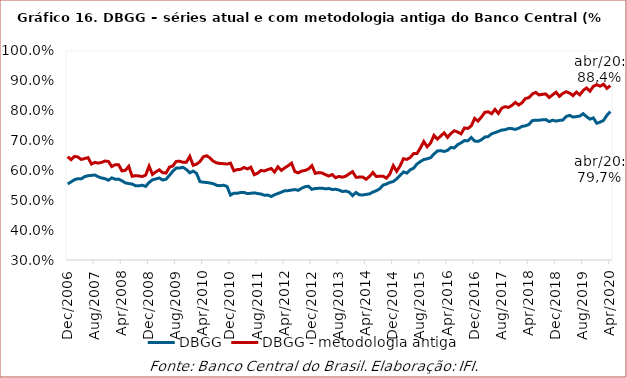
| Category | DBGG | DBGG - metodologia antiga |
|---|---|---|
| 2006-12-01 | 0.555 | 0.646 |
| 2007-01-01 | 0.562 | 0.636 |
| 2007-02-01 | 0.569 | 0.647 |
| 2007-03-01 | 0.572 | 0.645 |
| 2007-04-01 | 0.572 | 0.637 |
| 2007-05-01 | 0.579 | 0.64 |
| 2007-06-01 | 0.582 | 0.643 |
| 2007-07-01 | 0.583 | 0.622 |
| 2007-08-01 | 0.585 | 0.627 |
| 2007-09-01 | 0.579 | 0.625 |
| 2007-10-01 | 0.575 | 0.627 |
| 2007-11-01 | 0.572 | 0.631 |
| 2007-12-01 | 0.567 | 0.63 |
| 2008-01-01 | 0.575 | 0.613 |
| 2008-02-01 | 0.57 | 0.619 |
| 2008-03-01 | 0.571 | 0.619 |
| 2008-04-01 | 0.565 | 0.598 |
| 2008-05-01 | 0.558 | 0.6 |
| 2008-06-01 | 0.556 | 0.614 |
| 2008-07-01 | 0.555 | 0.58 |
| 2008-08-01 | 0.549 | 0.583 |
| 2008-09-01 | 0.548 | 0.582 |
| 2008-10-01 | 0.551 | 0.579 |
| 2008-11-01 | 0.547 | 0.585 |
| 2008-12-01 | 0.56 | 0.614 |
| 2009-01-01 | 0.569 | 0.587 |
| 2009-02-01 | 0.572 | 0.595 |
| 2009-03-01 | 0.575 | 0.602 |
| 2009-04-01 | 0.568 | 0.593 |
| 2009-05-01 | 0.571 | 0.591 |
| 2009-06-01 | 0.583 | 0.611 |
| 2009-07-01 | 0.597 | 0.615 |
| 2009-08-01 | 0.608 | 0.63 |
| 2009-09-01 | 0.608 | 0.631 |
| 2009-10-01 | 0.611 | 0.627 |
| 2009-11-01 | 0.603 | 0.628 |
| 2009-12-01 | 0.592 | 0.647 |
| 2010-01-01 | 0.598 | 0.617 |
| 2010-02-01 | 0.59 | 0.621 |
| 2010-03-01 | 0.562 | 0.63 |
| 2010-04-01 | 0.561 | 0.646 |
| 2010-05-01 | 0.56 | 0.649 |
| 2010-06-01 | 0.558 | 0.641 |
| 2010-07-01 | 0.555 | 0.63 |
| 2010-08-01 | 0.55 | 0.625 |
| 2010-09-01 | 0.549 | 0.623 |
| 2010-10-01 | 0.551 | 0.623 |
| 2010-11-01 | 0.546 | 0.621 |
| 2010-12-01 | 0.518 | 0.624 |
| 2011-01-01 | 0.524 | 0.599 |
| 2011-02-01 | 0.524 | 0.603 |
| 2011-03-01 | 0.526 | 0.604 |
| 2011-04-01 | 0.526 | 0.61 |
| 2011-05-01 | 0.523 | 0.605 |
| 2011-06-01 | 0.524 | 0.611 |
| 2011-07-01 | 0.525 | 0.586 |
| 2011-08-01 | 0.523 | 0.591 |
| 2011-09-01 | 0.521 | 0.6 |
| 2011-10-01 | 0.517 | 0.598 |
| 2011-11-01 | 0.517 | 0.603 |
| 2011-12-01 | 0.513 | 0.606 |
| 2012-01-01 | 0.519 | 0.595 |
| 2012-02-01 | 0.523 | 0.612 |
| 2012-03-01 | 0.527 | 0.6 |
| 2012-04-01 | 0.532 | 0.609 |
| 2012-05-01 | 0.532 | 0.616 |
| 2012-06-01 | 0.534 | 0.624 |
| 2012-07-01 | 0.536 | 0.596 |
| 2012-08-01 | 0.533 | 0.592 |
| 2012-09-01 | 0.541 | 0.598 |
| 2012-10-01 | 0.546 | 0.6 |
| 2012-11-01 | 0.547 | 0.605 |
| 2012-12-01 | 0.537 | 0.616 |
| 2013-01-01 | 0.54 | 0.59 |
| 2013-02-01 | 0.54 | 0.593 |
| 2013-03-01 | 0.541 | 0.592 |
| 2013-04-01 | 0.538 | 0.586 |
| 2013-05-01 | 0.54 | 0.581 |
| 2013-06-01 | 0.536 | 0.586 |
| 2013-07-01 | 0.537 | 0.576 |
| 2013-08-01 | 0.534 | 0.58 |
| 2013-09-01 | 0.529 | 0.577 |
| 2013-10-01 | 0.531 | 0.581 |
| 2013-11-01 | 0.527 | 0.589 |
| 2013-12-01 | 0.515 | 0.596 |
| 2014-01-01 | 0.526 | 0.577 |
| 2014-02-01 | 0.518 | 0.578 |
| 2014-03-01 | 0.518 | 0.578 |
| 2014-04-01 | 0.52 | 0.57 |
| 2014-05-01 | 0.521 | 0.58 |
| 2014-06-01 | 0.527 | 0.593 |
| 2014-07-01 | 0.532 | 0.579 |
| 2014-08-01 | 0.538 | 0.581 |
| 2014-09-01 | 0.551 | 0.581 |
| 2014-10-01 | 0.554 | 0.574 |
| 2014-11-01 | 0.56 | 0.588 |
| 2014-12-01 | 0.563 | 0.616 |
| 2015-01-01 | 0.572 | 0.597 |
| 2015-02-01 | 0.583 | 0.615 |
| 2015-03-01 | 0.595 | 0.639 |
| 2015-04-01 | 0.591 | 0.637 |
| 2015-05-01 | 0.602 | 0.643 |
| 2015-06-01 | 0.607 | 0.656 |
| 2015-07-01 | 0.622 | 0.657 |
| 2015-08-01 | 0.63 | 0.675 |
| 2015-09-01 | 0.636 | 0.697 |
| 2015-10-01 | 0.639 | 0.679 |
| 2015-11-01 | 0.643 | 0.692 |
| 2015-12-01 | 0.655 | 0.717 |
| 2016-01-01 | 0.665 | 0.705 |
| 2016-02-01 | 0.666 | 0.715 |
| 2016-03-01 | 0.663 | 0.726 |
| 2016-04-01 | 0.667 | 0.711 |
| 2016-05-01 | 0.677 | 0.724 |
| 2016-06-01 | 0.675 | 0.733 |
| 2016-07-01 | 0.687 | 0.729 |
| 2016-08-01 | 0.692 | 0.722 |
| 2016-09-01 | 0.7 | 0.742 |
| 2016-10-01 | 0.699 | 0.74 |
| 2016-11-01 | 0.71 | 0.749 |
| 2016-12-01 | 0.698 | 0.774 |
| 2017-01-01 | 0.697 | 0.765 |
| 2017-02-01 | 0.703 | 0.779 |
| 2017-03-01 | 0.712 | 0.795 |
| 2017-04-01 | 0.713 | 0.796 |
| 2017-05-01 | 0.723 | 0.79 |
| 2017-06-01 | 0.726 | 0.804 |
| 2017-07-01 | 0.731 | 0.791 |
| 2017-08-01 | 0.735 | 0.809 |
| 2017-09-01 | 0.736 | 0.813 |
| 2017-10-01 | 0.741 | 0.811 |
| 2017-11-01 | 0.74 | 0.818 |
| 2017-12-01 | 0.737 | 0.828 |
| 2018-01-01 | 0.741 | 0.819 |
| 2018-02-01 | 0.748 | 0.827 |
| 2018-03-01 | 0.749 | 0.841 |
| 2018-04-01 | 0.754 | 0.844 |
| 2018-05-01 | 0.767 | 0.856 |
| 2018-06-01 | 0.768 | 0.861 |
| 2018-07-01 | 0.768 | 0.853 |
| 2018-08-01 | 0.77 | 0.855 |
| 2018-09-01 | 0.77 | 0.856 |
| 2018-10-01 | 0.763 | 0.845 |
| 2018-11-01 | 0.768 | 0.853 |
| 2018-12-01 | 0.765 | 0.862 |
| 2019-01-01 | 0.768 | 0.848 |
| 2019-02-01 | 0.769 | 0.858 |
| 2019-03-01 | 0.781 | 0.864 |
| 2019-04-01 | 0.785 | 0.859 |
| 2019-05-01 | 0.779 | 0.85 |
| 2019-06-01 | 0.78 | 0.862 |
| 2019-07-01 | 0.782 | 0.853 |
| 2019-08-01 | 0.79 | 0.868 |
| 2019-09-01 | 0.78 | 0.876 |
| 2019-10-01 | 0.772 | 0.865 |
| 2019-11-01 | 0.776 | 0.881 |
| 2019-12-01 | 0.758 | 0.887 |
| 2020-01-01 | 0.762 | 0.882 |
| 2020-02-01 | 0.767 | 0.889 |
| 2020-03-01 | 0.785 | 0.875 |
| 2020-04-01 | 0.797 | 0.884 |